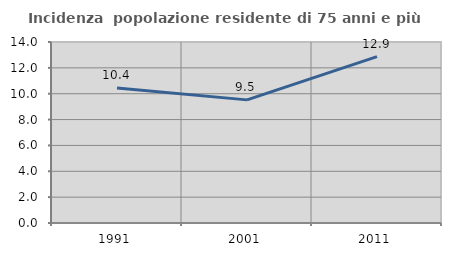
| Category | Incidenza  popolazione residente di 75 anni e più |
|---|---|
| 1991.0 | 10.446 |
| 2001.0 | 9.524 |
| 2011.0 | 12.864 |